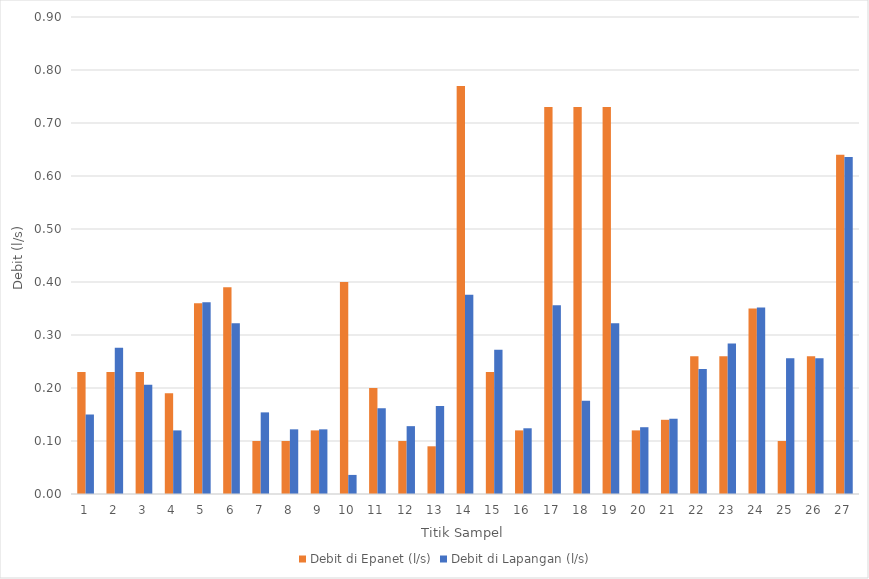
| Category | Debit di Epanet (l/s) | Debit di Lapangan (l/s) |
|---|---|---|
| 0 | 0.23 | 0.15 |
| 1 | 0.23 | 0.276 |
| 2 | 0.23 | 0.206 |
| 3 | 0.19 | 0.12 |
| 4 | 0.36 | 0.362 |
| 5 | 0.39 | 0.322 |
| 6 | 0.1 | 0.154 |
| 7 | 0.1 | 0.122 |
| 8 | 0.12 | 0.122 |
| 9 | 0.4 | 0.036 |
| 10 | 0.2 | 0.162 |
| 11 | 0.1 | 0.128 |
| 12 | 0.09 | 0.166 |
| 13 | 0.77 | 0.376 |
| 14 | 0.23 | 0.272 |
| 15 | 0.12 | 0.124 |
| 16 | 0.73 | 0.356 |
| 17 | 0.73 | 0.176 |
| 18 | 0.73 | 0.322 |
| 19 | 0.12 | 0.126 |
| 20 | 0.14 | 0.142 |
| 21 | 0.26 | 0.236 |
| 22 | 0.26 | 0.284 |
| 23 | 0.35 | 0.352 |
| 24 | 0.1 | 0.256 |
| 25 | 0.26 | 0.256 |
| 26 | 0.64 | 0.636 |